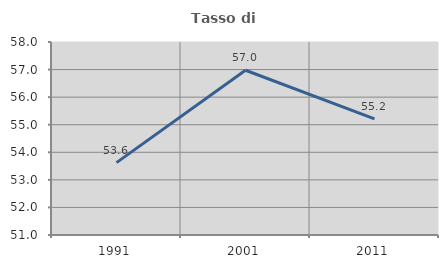
| Category | Tasso di occupazione   |
|---|---|
| 1991.0 | 53.625 |
| 2001.0 | 56.976 |
| 2011.0 | 55.21 |